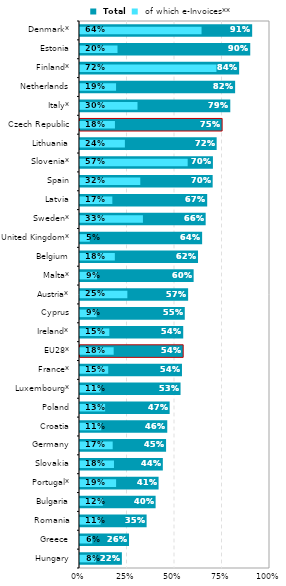
| Category |  Total |
|---|---|
| Hungary | 0.22 |
| Greece | 0.258 |
| Romania | 0.351 |
| Bulgaria | 0.398 |
| Portugal* | 0.414 |
| Slovakia | 0.436 |
| Germany | 0.453 |
| Croatia | 0.459 |
| Poland | 0.472 |
| Luxembourg* | 0.529 |
| France* | 0.537 |
| EU28* | 0.543 |
| Ireland* | 0.543 |
| Cyprus | 0.551 |
| Austria* | 0.569 |
| Malta* | 0.598 |
| Belgium | 0.621 |
| United Kingdom* | 0.643 |
| Sweden* | 0.661 |
| Latvia | 0.669 |
| Spain | 0.698 |
| Slovenia* | 0.7 |
| Lithuania | 0.719 |
| Czech Republic | 0.748 |
| Italy* | 0.791 |
| Netherlands | 0.816 |
| Finland* | 0.838 |
| Estonia | 0.896 |
| Denmark* | 0.906 |